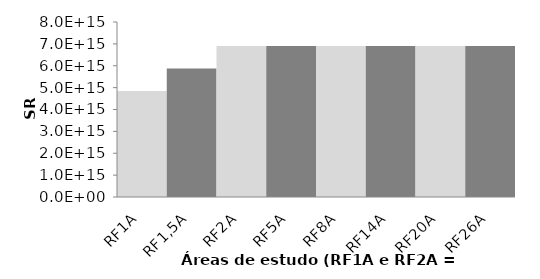
| Category | Series 0 |
|---|---|
| RF1A | 4850501334269663 |
| RF1,5A | 5877864044943819 |
| RF2A | 6905226755617978 |
| RF5A | 6905226755617978 |
| RF8A | 6905226755617978 |
| RF14A | 6905226755617978 |
| RF20A | 6905226755617978 |
| RF26A | 6905226755617978 |